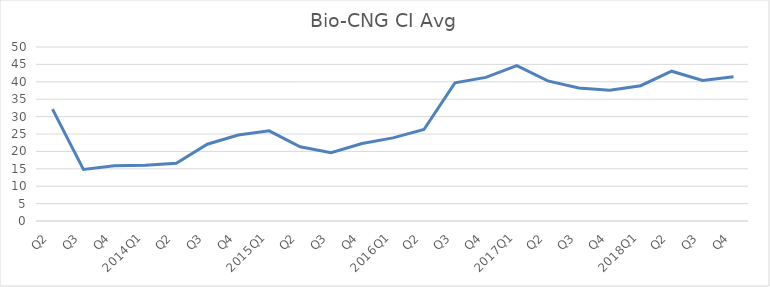
| Category | 2011Q1 |
|---|---|
| Q2 | 32.15 |
| Q3 | 14.82 |
| Q4 | 15.85 |
| 2014Q1 | 15.99 |
| Q2 | 16.58 |
| Q3 | 22.07 |
| Q4 | 24.73 |
| 2015Q1 | 25.91 |
| Q2 | 21.34 |
| Q3 | 19.63 |
| Q4 | 22.25 |
| 2016Q1 | 23.88 |
| Q2 | 26.28 |
| Q3 | 39.71 |
| Q4 | 41.27 |
| 2017Q1 | 44.65 |
| Q2 | 40.26 |
| Q3 | 38.22 |
| Q4 | 37.55 |
| 2018Q1 | 38.88 |
| Q2 | 43.04 |
| Q3 | 40.39 |
| Q4 | 41.44 |